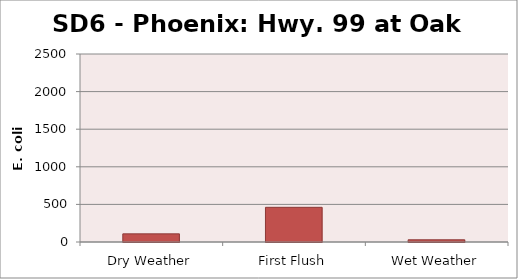
| Category | E. coli MPN |
|---|---|
| Dry Weather | 108.1 |
| First Flush | 461.1 |
| Wet Weather | 29.2 |